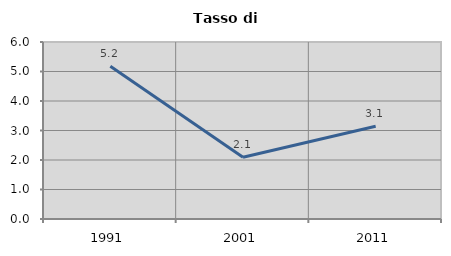
| Category | Tasso di disoccupazione   |
|---|---|
| 1991.0 | 5.181 |
| 2001.0 | 2.094 |
| 2011.0 | 3.141 |